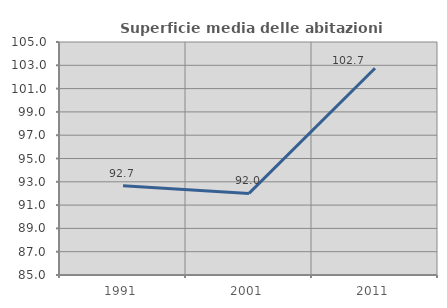
| Category | Superficie media delle abitazioni occupate |
|---|---|
| 1991.0 | 92.663 |
| 2001.0 | 92.002 |
| 2011.0 | 102.748 |